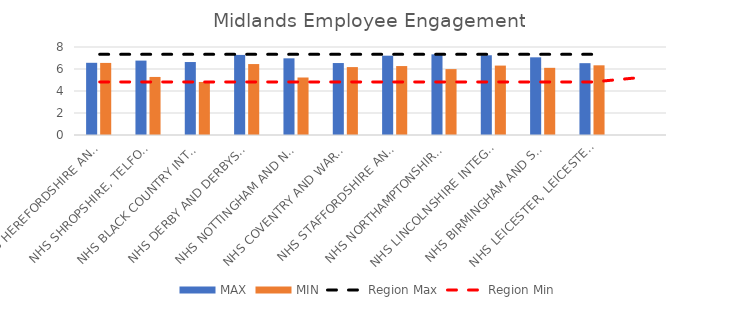
| Category | MAX | MIN |
|---|---|---|
| NHS HEREFORDSHIRE AND WORCESTERSHIRE INTEGRATED CARE BOARD | 6.564 | 6.553 |
| NHS SHROPSHIRE, TELFORD AND WREKIN INTEGRATED CARE BOARD | 6.764 | 5.278 |
| NHS BLACK COUNTRY INTEGRATED CARE BOARD | 6.634 | 4.821 |
| NHS DERBY AND DERBYSHIRE INTEGRATED CARE BOARD | 7.28 | 6.449 |
| NHS NOTTINGHAM AND NOTTINGHAMSHIRE INTEGRATED CARE BOARD | 6.971 | 5.227 |
| NHS COVENTRY AND WARWICKSHIRE INTEGRATED CARE BOARD | 6.542 | 6.174 |
| NHS STAFFORDSHIRE AND STOKE-ON-TRENT INTEGRATED CARE BOARD | 7.21 | 6.267 |
| NHS NORTHAMPTONSHIRE INTEGRATED CARE BOARD | 7.332 | 5.99 |
| NHS LINCOLNSHIRE INTEGRATED CARE BOARD | 7.249 | 6.311 |
| NHS BIRMINGHAM AND SOLIHULL INTEGRATED CARE BOARD | 7.062 | 6.107 |
| NHS LEICESTER, LEICESTERSHIRE AND RUTLAND INTEGRATED CARE BOARD | 6.53 | 6.335 |